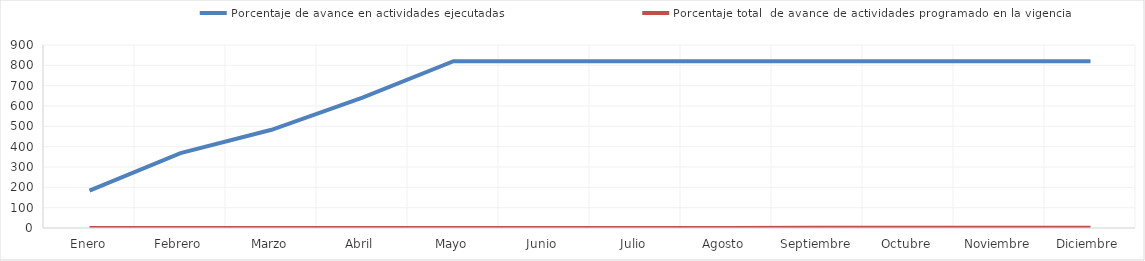
| Category | Porcentaje de avance en actividades ejecutadas | Porcentaje total  de avance de actividades programado en la vigencia |
|---|---|---|
| 0 | 184 | 0 |
| 1 | 368 | 0 |
| 2 | 483 | 0.25 |
| 3 | 641 | 0.25 |
| 4 | 820 | 0.5 |
| 5 | 820 | 0.5 |
| 6 | 820 | 0.5 |
| 7 | 820 | 0.5 |
| 8 | 820 | 0.75 |
| 9 | 820 | 0.75 |
| 10 | 820 | 0.75 |
| 11 | 820 | 1 |